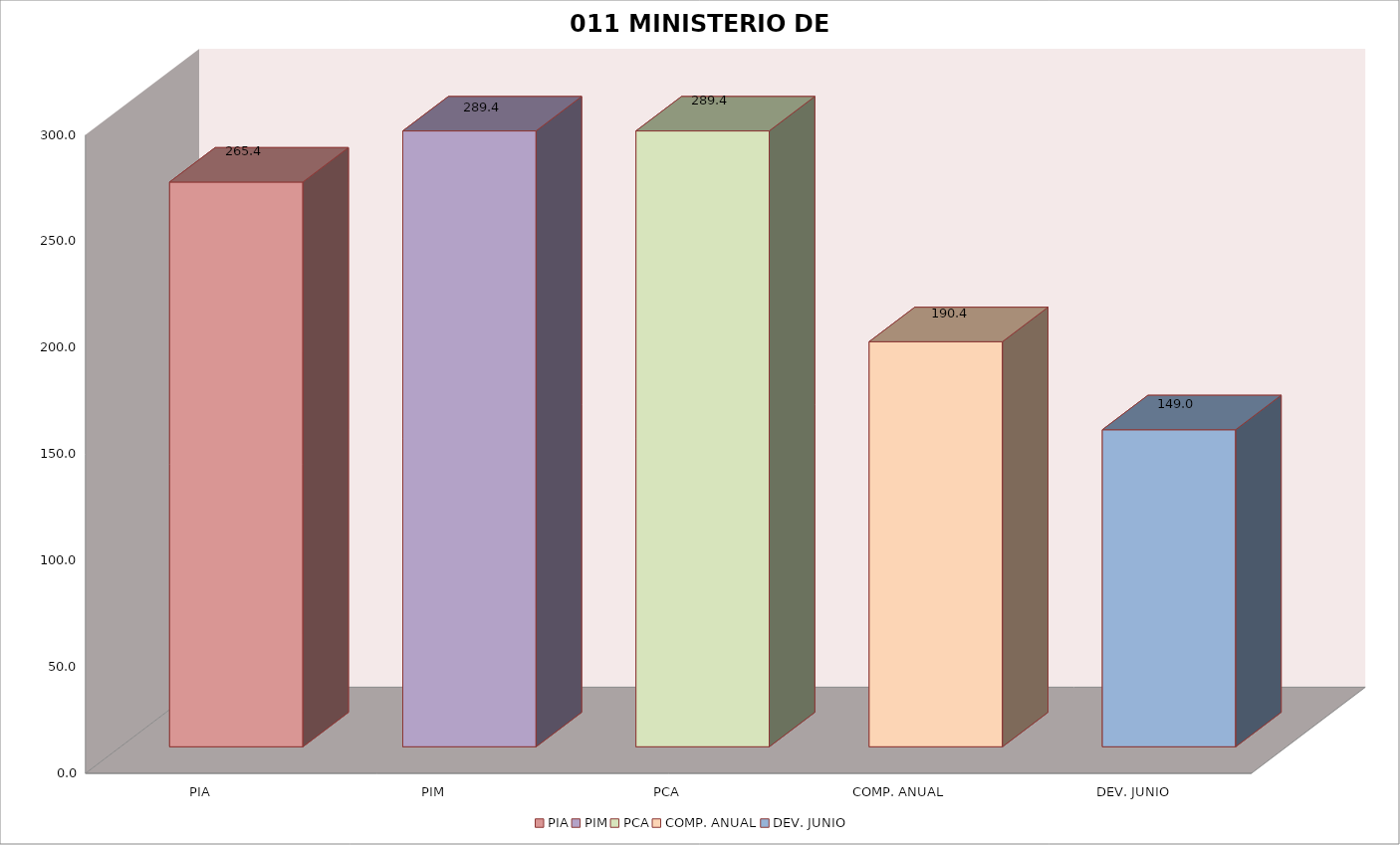
| Category | 011 MINISTERIO DE SALUD |
|---|---|
| PIA | 265.378 |
| PIM | 289.406 |
| PCA | 289.406 |
| COMP. ANUAL | 190.354 |
| DEV. JUNIO | 148.987 |